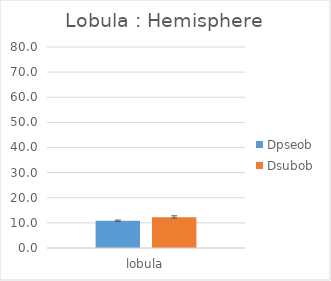
| Category | Dpseob | Dsubob |
|---|---|---|
| lobula | 10.826 | 12.213 |